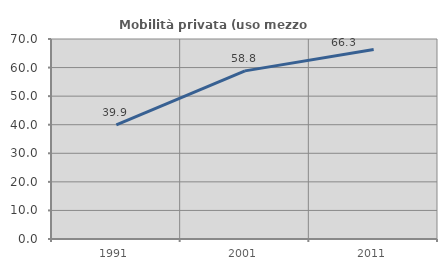
| Category | Mobilità privata (uso mezzo privato) |
|---|---|
| 1991.0 | 39.935 |
| 2001.0 | 58.843 |
| 2011.0 | 66.333 |